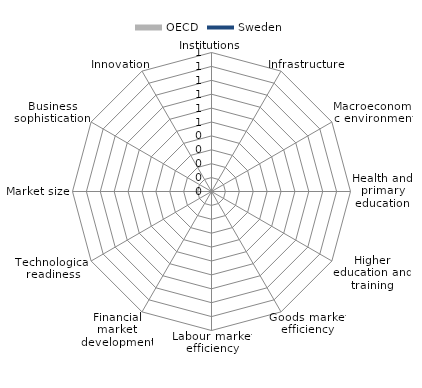
| Category | OECD |
|---|---|
| Institutions | 0 |
| Infrastructure | 0 |
| Macroeconomic environment | 0 |
| Health and primary education | 0 |
| Higher education and training | 0 |
| Goods market efficiency | 0 |
| Labour market efficiency | 0 |
| Financial market development | 0 |
| Technological readiness | 0 |
| Market size | 0 |
| Business sophistication | 0 |
| Innovation | 0 |